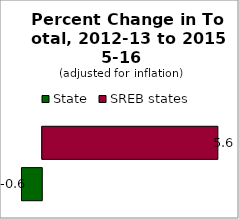
| Category | State | SREB states |
|---|---|---|
| 0 | -0.649 | 5.612 |